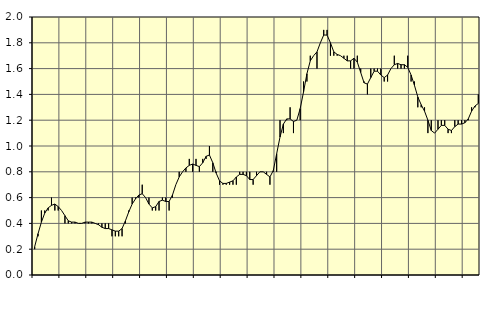
| Category | Piggar | Anställda utomlands |
|---|---|---|
| nan | 0.2 | 0.22 |
| 87.0 | 0.3 | 0.32 |
| 87.0 | 0.5 | 0.41 |
| 87.0 | 0.5 | 0.48 |
| nan | 0.5 | 0.52 |
| 88.0 | 0.6 | 0.54 |
| 88.0 | 0.5 | 0.55 |
| 88.0 | 0.5 | 0.53 |
| nan | 0.5 | 0.5 |
| 89.0 | 0.4 | 0.46 |
| 89.0 | 0.4 | 0.42 |
| 89.0 | 0.4 | 0.41 |
| nan | 0.4 | 0.41 |
| 90.0 | 0.4 | 0.4 |
| 90.0 | 0.4 | 0.4 |
| 90.0 | 0.4 | 0.41 |
| nan | 0.4 | 0.41 |
| 91.0 | 0.4 | 0.41 |
| 91.0 | 0.4 | 0.4 |
| 91.0 | 0.4 | 0.39 |
| nan | 0.4 | 0.37 |
| 92.0 | 0.4 | 0.36 |
| 92.0 | 0.4 | 0.36 |
| 92.0 | 0.3 | 0.35 |
| nan | 0.3 | 0.34 |
| 93.0 | 0.3 | 0.34 |
| 93.0 | 0.3 | 0.36 |
| 93.0 | 0.4 | 0.42 |
| nan | 0.5 | 0.49 |
| 94.0 | 0.6 | 0.55 |
| 94.0 | 0.6 | 0.59 |
| 94.0 | 0.6 | 0.62 |
| nan | 0.7 | 0.63 |
| 95.0 | 0.6 | 0.6 |
| 95.0 | 0.6 | 0.55 |
| 95.0 | 0.5 | 0.52 |
| nan | 0.5 | 0.53 |
| 96.0 | 0.5 | 0.57 |
| 96.0 | 0.6 | 0.58 |
| 96.0 | 0.6 | 0.57 |
| nan | 0.5 | 0.57 |
| 97.0 | 0.6 | 0.62 |
| 97.0 | 0.7 | 0.7 |
| 97.0 | 0.8 | 0.76 |
| nan | 0.8 | 0.8 |
| 98.0 | 0.8 | 0.83 |
| 98.0 | 0.9 | 0.85 |
| 98.0 | 0.8 | 0.86 |
| nan | 0.9 | 0.85 |
| 99.0 | 0.8 | 0.84 |
| 99.0 | 0.9 | 0.87 |
| 99.0 | 0.9 | 0.92 |
| nan | 1 | 0.93 |
| 0.0 | 0.8 | 0.87 |
| 0.0 | 0.8 | 0.79 |
| 0.0 | 0.7 | 0.73 |
| nan | 0.7 | 0.71 |
| 1.0 | 0.7 | 0.71 |
| 1.0 | 0.7 | 0.72 |
| 1.0 | 0.7 | 0.73 |
| nan | 0.7 | 0.76 |
| 2.0 | 0.8 | 0.78 |
| 2.0 | 0.8 | 0.78 |
| 2.0 | 0.8 | 0.77 |
| nan | 0.8 | 0.74 |
| 3.0 | 0.7 | 0.74 |
| 3.0 | 0.8 | 0.77 |
| 3.0 | 0.8 | 0.8 |
| nan | 0.8 | 0.8 |
| 4.0 | 0.8 | 0.78 |
| 4.0 | 0.7 | 0.76 |
| 4.0 | 0.8 | 0.81 |
| nan | 0.8 | 0.94 |
| 5.0 | 1.2 | 1.07 |
| 5.0 | 1.1 | 1.17 |
| 5.0 | 1.2 | 1.21 |
| nan | 1.3 | 1.21 |
| 6.0 | 1.1 | 1.19 |
| 6.0 | 1.2 | 1.2 |
| 6.0 | 1.2 | 1.29 |
| nan | 1.5 | 1.42 |
| 7.0 | 1.5 | 1.56 |
| 7.0 | 1.7 | 1.66 |
| 7.0 | 1.7 | 1.7 |
| nan | 1.6 | 1.73 |
| 8.0 | 1.8 | 1.8 |
| 8.0 | 1.9 | 1.86 |
| 8.0 | 1.9 | 1.86 |
| nan | 1.7 | 1.8 |
| 9.0 | 1.7 | 1.73 |
| 9.0 | 1.7 | 1.71 |
| 9.0 | 1.7 | 1.7 |
| nan | 1.7 | 1.68 |
| 10.0 | 1.7 | 1.66 |
| 10.0 | 1.6 | 1.66 |
| 10.0 | 1.6 | 1.68 |
| nan | 1.7 | 1.65 |
| 11.0 | 1.6 | 1.57 |
| 11.0 | 1.5 | 1.49 |
| 11.0 | 1.4 | 1.48 |
| nan | 1.6 | 1.53 |
| 12.0 | 1.6 | 1.58 |
| 12.0 | 1.6 | 1.58 |
| 12.0 | 1.6 | 1.55 |
| nan | 1.5 | 1.53 |
| 13.0 | 1.5 | 1.55 |
| 13.0 | 1.6 | 1.6 |
| 13.0 | 1.7 | 1.63 |
| nan | 1.6 | 1.64 |
| 14.0 | 1.6 | 1.63 |
| 14.0 | 1.6 | 1.63 |
| 14.0 | 1.7 | 1.61 |
| nan | 1.5 | 1.55 |
| 15.0 | 1.5 | 1.47 |
| 15.0 | 1.3 | 1.38 |
| 15.0 | 1.3 | 1.32 |
| nan | 1.3 | 1.27 |
| 16.0 | 1.1 | 1.2 |
| 16.0 | 1.2 | 1.12 |
| 16.0 | 1.1 | 1.1 |
| nan | 1.2 | 1.13 |
| 17.0 | 1.2 | 1.16 |
| 17.0 | 1.2 | 1.16 |
| 17.0 | 1.1 | 1.13 |
| nan | 1.1 | 1.12 |
| 18.0 | 1.2 | 1.15 |
| 18.0 | 1.2 | 1.17 |
| 18.0 | 1.2 | 1.17 |
| nan | 1.2 | 1.18 |
| 19.0 | 1.2 | 1.21 |
| 19.0 | 1.3 | 1.27 |
| 19.0 | 1.3 | 1.31 |
| nan | 1.4 | 1.33 |